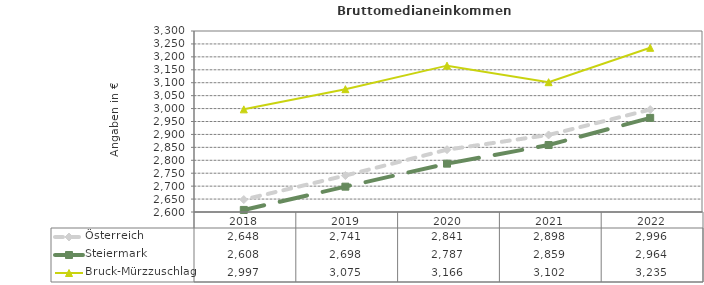
| Category | Österreich | Steiermark | Bruck-Mürzzuschlag |
|---|---|---|---|
| 2022.0 | 2996 | 2964 | 3235 |
| 2021.0 | 2898 | 2859 | 3102 |
| 2020.0 | 2841 | 2787 | 3166 |
| 2019.0 | 2741 | 2698 | 3075 |
| 2018.0 | 2648 | 2608 | 2997 |